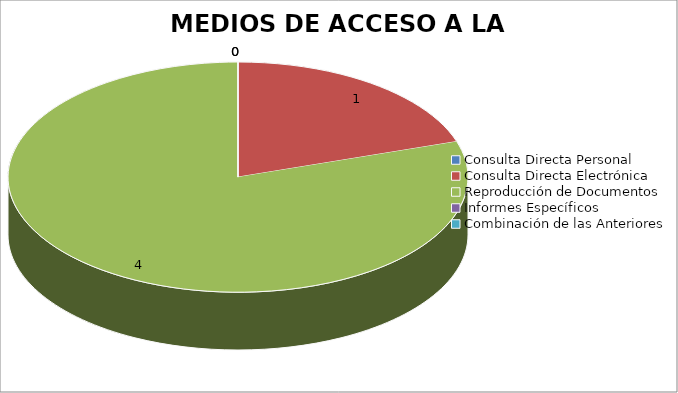
| Category | MEDIOS DE ACCESO A LA INFORMACIÓN |
|---|---|
| 0 | 0 |
| 1 | 1 |
| 2 | 4 |
| 3 | 0 |
| 4 | 0 |